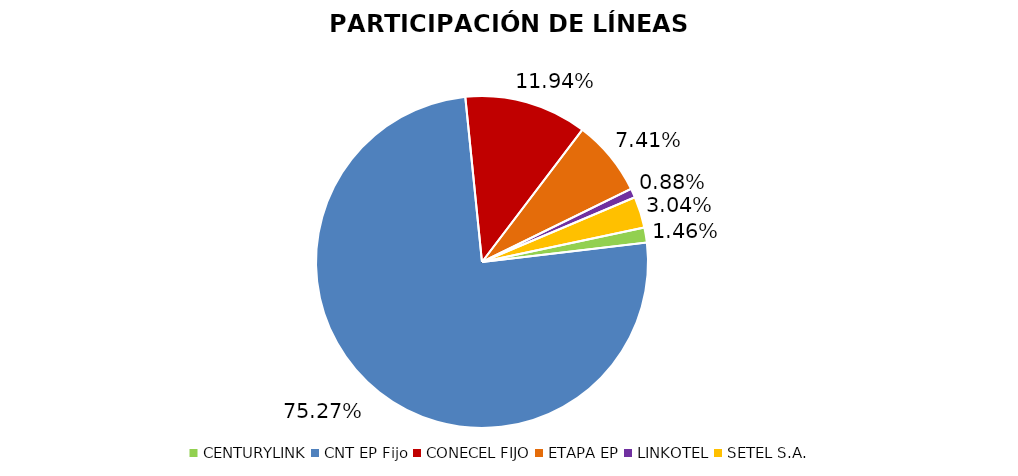
| Category | Participación en el Mercado |
|---|---|
| CENTURYLINK | 0.015 |
| CNT EP Fijo | 0.753 |
| CONECEL FIJO | 0.119 |
| ETAPA EP | 0.074 |
| LINKOTEL | 0.009 |
| SETEL S.A. | 0.03 |